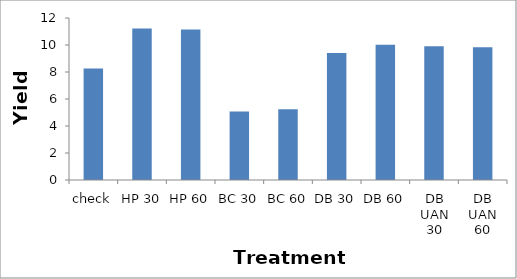
| Category | Series 0 |
|---|---|
| check | 8.255 |
| HP 30 | 11.218 |
| HP 60 | 11.144 |
| BC 30 | 5.079 |
| BC 60 | 5.237 |
| DB 30 | 9.406 |
| DB 60 | 10.013 |
| DB UAN 30 | 9.907 |
| DB UAN 60 | 9.835 |